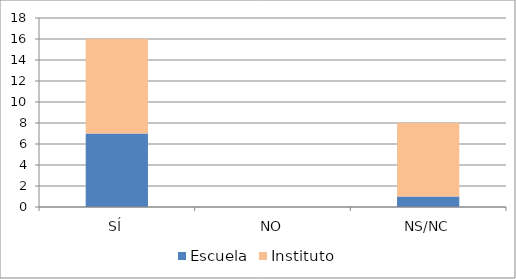
| Category | Escuela | Instituto |
|---|---|---|
| SÍ | 7 | 9 |
| NO | 0 | 0 |
| NS/NC | 1 | 7 |